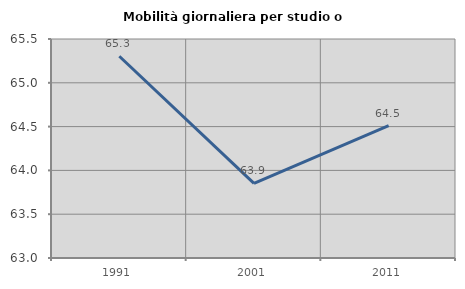
| Category | Mobilità giornaliera per studio o lavoro |
|---|---|
| 1991.0 | 65.303 |
| 2001.0 | 63.852 |
| 2011.0 | 64.512 |